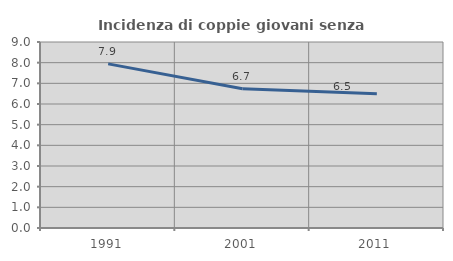
| Category | Incidenza di coppie giovani senza figli |
|---|---|
| 1991.0 | 7.942 |
| 2001.0 | 6.734 |
| 2011.0 | 6.502 |